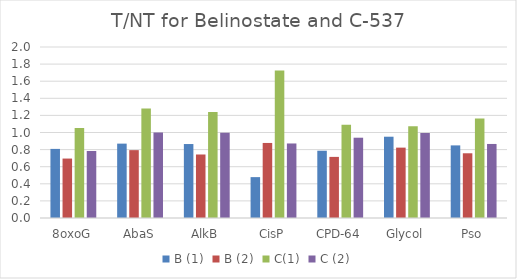
| Category | B (1) | B (2) | C(1) | C (2) |
|---|---|---|---|---|
| 8oxoG | 0.808 | 0.695 | 1.053 | 0.784 |
| AbaS | 0.87 | 0.794 | 1.282 | 1.001 |
| AlkB | 0.865 | 0.743 | 1.239 | 0.998 |
| CisP | 0.478 | 0.878 | 1.726 | 0.872 |
| CPD-64 | 0.787 | 0.715 | 1.09 | 0.939 |
| Glycol | 0.951 | 0.823 | 1.074 | 0.995 |
| Pso | 0.849 | 0.757 | 1.163 | 0.866 |